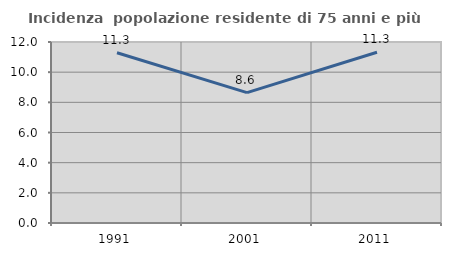
| Category | Incidenza  popolazione residente di 75 anni e più |
|---|---|
| 1991.0 | 11.285 |
| 2001.0 | 8.646 |
| 2011.0 | 11.321 |